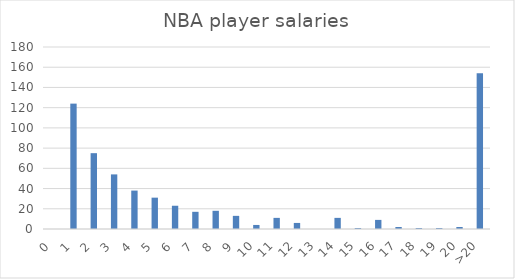
| Category | Freqency |
|---|---|
| 0 | 0 |
| 1 | 124 |
| 2 | 75 |
| 3 | 54 |
| 4 | 38 |
| 5 | 31 |
| 6 | 23 |
| 7 | 17 |
| 8 | 18 |
| 9 | 13 |
| 10 | 4 |
| 11 | 11 |
| 12 | 6 |
| 13 | 0 |
| 14 | 11 |
| 15 | 1 |
| 16 | 9 |
| 17 | 2 |
| 18 | 1 |
| 19 | 1 |
| 20 | 2 |
| >20 | 154 |